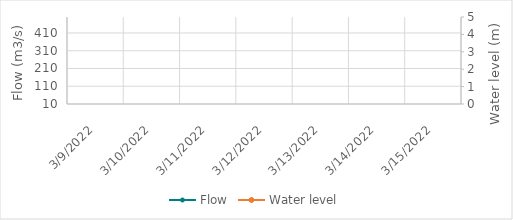
| Category | Flow |
|---|---|
| 2/23/22 | 322.81 |
| 2/22/22 | 341.9 |
| 2/21/22 | 388.85 |
| 2/20/22 | 427.81 |
| 2/19/22 | 415.12 |
| 2/18/22 | 354.31 |
| 2/17/22 | 371.69 |